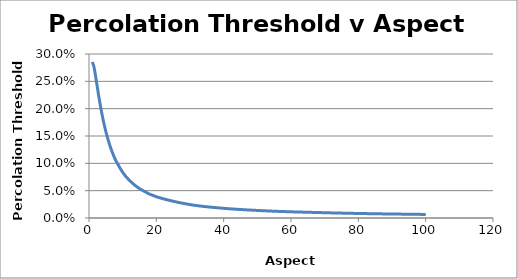
| Category | Series 0 |
|---|---|
| 1.0 | 0.285 |
| 1.5 | 0.276 |
| 2.0 | 0.258 |
| 3.0 | 0.219 |
| 4.0 | 0.186 |
| 5.0 | 0.158 |
| 6.0 | 0.136 |
| 7.0 | 0.119 |
| 8.0 | 0.105 |
| 10.0 | 0.084 |
| 12.0 | 0.069 |
| 15.0 | 0.054 |
| 20.0 | 0.039 |
| 30.0 | 0.025 |
| 40.0 | 0.018 |
| 50.0 | 0.014 |
| 60.0 | 0.011 |
| 80.0 | 0.008 |
| 100.0 | 0.007 |